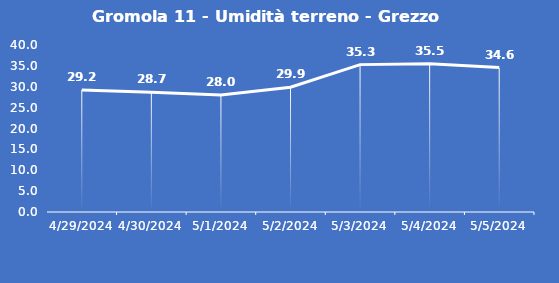
| Category | Gromola 11 - Umidità terreno - Grezzo (%VWC) |
|---|---|
| 4/29/24 | 29.2 |
| 4/30/24 | 28.7 |
| 5/1/24 | 28 |
| 5/2/24 | 29.9 |
| 5/3/24 | 35.3 |
| 5/4/24 | 35.5 |
| 5/5/24 | 34.6 |